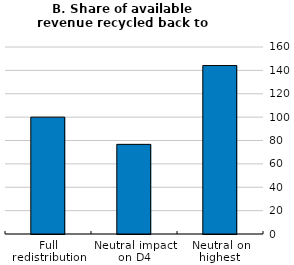
| Category | Series 0 |
|---|---|
| Full redistribution | 100 |
| Neutral impact on D4 | 76.704 |
| Neutral on highest 
regional D4 | 144.119 |